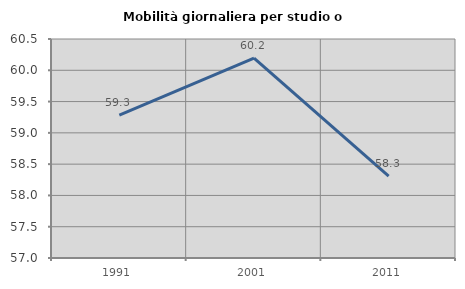
| Category | Mobilità giornaliera per studio o lavoro |
|---|---|
| 1991.0 | 59.285 |
| 2001.0 | 60.193 |
| 2011.0 | 58.307 |